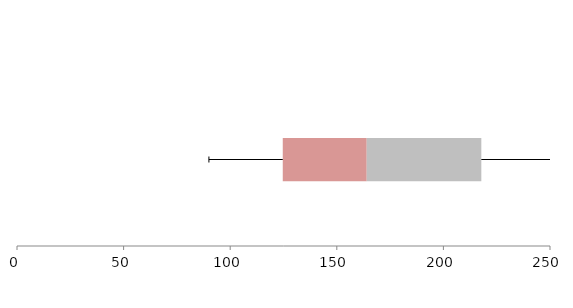
| Category | Series 1 | Series 2 | Series 3 |
|---|---|---|---|
| 0 | 124.654 | 39.388 | 53.743 |